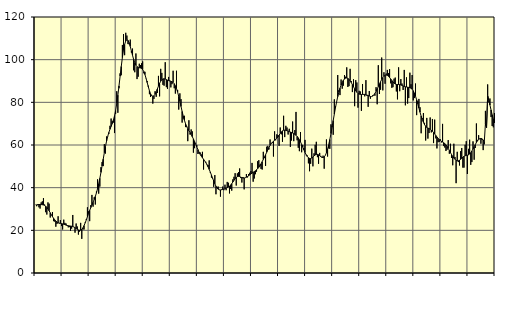
| Category | Piggar | Series 1 |
|---|---|---|
| nan | 32 | 31.98 |
| 87.0 | 31.3 | 31.92 |
| 87.0 | 32.3 | 32.09 |
| 87.0 | 30.8 | 32.1 |
| 87.0 | 30.2 | 32.1 |
| 87.0 | 33.1 | 32.07 |
| 87.0 | 33.6 | 32 |
| 87.0 | 35.1 | 31.88 |
| 87.0 | 32.1 | 31.68 |
| 87.0 | 28.5 | 31.33 |
| 87.0 | 27.4 | 30.77 |
| 87.0 | 33.1 | 30.03 |
| nan | 32.5 | 29.16 |
| 88.0 | 26 | 28.23 |
| 88.0 | 27.1 | 27.31 |
| 88.0 | 28.6 | 26.43 |
| 88.0 | 24.3 | 25.63 |
| 88.0 | 24.1 | 24.93 |
| 88.0 | 21.7 | 24.35 |
| 88.0 | 23 | 23.9 |
| 88.0 | 26.6 | 23.58 |
| 88.0 | 23.2 | 23.4 |
| 88.0 | 24.8 | 23.29 |
| 88.0 | 22 | 23.17 |
| nan | 20.4 | 23.03 |
| 89.0 | 25 | 22.85 |
| 89.0 | 23.5 | 22.66 |
| 89.0 | 23.2 | 22.47 |
| 89.0 | 22.1 | 22.31 |
| 89.0 | 21.4 | 22.17 |
| 89.0 | 21.5 | 22.08 |
| 89.0 | 19.8 | 22.02 |
| 89.0 | 20.8 | 21.93 |
| 89.0 | 27.2 | 21.78 |
| 89.0 | 21.6 | 21.56 |
| 89.0 | 18.9 | 21.23 |
| nan | 23.2 | 20.85 |
| 90.0 | 21.8 | 20.48 |
| 90.0 | 18 | 20.18 |
| 90.0 | 19.4 | 20.02 |
| 90.0 | 23.5 | 20.1 |
| 90.0 | 16 | 20.46 |
| 90.0 | 20.4 | 21.18 |
| 90.0 | 20.4 | 22.21 |
| 90.0 | 23.7 | 23.47 |
| 90.0 | 25.3 | 24.88 |
| 90.0 | 30.8 | 26.38 |
| 90.0 | 28.9 | 27.88 |
| nan | 24.3 | 29.32 |
| 91.0 | 31.8 | 30.66 |
| 91.0 | 36.6 | 31.91 |
| 91.0 | 31.1 | 33.15 |
| 91.0 | 35.5 | 34.44 |
| 91.0 | 32.1 | 35.88 |
| 91.0 | 38.2 | 37.56 |
| 91.0 | 43.9 | 39.54 |
| 91.0 | 37.2 | 41.82 |
| 91.0 | 40.5 | 44.37 |
| 91.0 | 49.6 | 47.17 |
| 91.0 | 52 | 50.19 |
| nan | 50.1 | 53.33 |
| 92.0 | 60.4 | 56.41 |
| 92.0 | 56 | 59.28 |
| 92.0 | 64 | 61.85 |
| 92.0 | 63.9 | 64.04 |
| 92.0 | 65.2 | 65.88 |
| 92.0 | 69 | 67.4 |
| 92.0 | 72.4 | 68.69 |
| 92.0 | 71.1 | 70 |
| 92.0 | 70.5 | 71.57 |
| 92.0 | 65.6 | 73.58 |
| 92.0 | 74.6 | 76.18 |
| nan | 85.2 | 79.45 |
| 93.0 | 75.1 | 83.34 |
| 93.0 | 86.6 | 87.7 |
| 93.0 | 93.6 | 92.28 |
| 93.0 | 92.7 | 96.81 |
| 93.0 | 106.9 | 100.99 |
| 93.0 | 112 | 104.5 |
| 93.0 | 102.1 | 107.13 |
| 93.0 | 112.6 | 108.76 |
| 93.0 | 111.3 | 109.38 |
| 93.0 | 107.3 | 109.06 |
| 93.0 | 107.2 | 107.94 |
| nan | 109.4 | 106.19 |
| 94.0 | 103.3 | 104.11 |
| 94.0 | 105.2 | 102.02 |
| 94.0 | 95 | 100.12 |
| 94.0 | 94.1 | 98.57 |
| 94.0 | 102.9 | 97.44 |
| 94.0 | 90.9 | 96.71 |
| 94.0 | 92 | 96.33 |
| 94.0 | 98.1 | 96.2 |
| 94.0 | 97.5 | 96.1 |
| 94.0 | 98.3 | 95.87 |
| 94.0 | 99.2 | 95.35 |
| nan | 93.6 | 94.42 |
| 95.0 | 94.3 | 93.04 |
| 95.0 | 91.4 | 91.27 |
| 95.0 | 90 | 89.29 |
| 95.0 | 87.8 | 87.3 |
| 95.0 | 83.8 | 85.46 |
| 95.0 | 82.5 | 84 |
| 95.0 | 83.4 | 83.11 |
| 95.0 | 79.4 | 82.79 |
| 95.0 | 81.6 | 83.03 |
| 95.0 | 85.2 | 83.79 |
| 95.0 | 82.6 | 84.91 |
| nan | 84.4 | 86.24 |
| 96.0 | 92.4 | 87.62 |
| 96.0 | 82.8 | 88.89 |
| 96.0 | 95.7 | 89.9 |
| 96.0 | 93.8 | 90.58 |
| 96.0 | 88.2 | 90.96 |
| 96.0 | 87.8 | 91.04 |
| 96.0 | 98.8 | 90.89 |
| 96.0 | 87.1 | 90.66 |
| 96.0 | 86.3 | 90.41 |
| 96.0 | 91.9 | 90.18 |
| 96.0 | 90.2 | 90 |
| nan | 87 | 89.86 |
| 97.0 | 88.5 | 89.65 |
| 97.0 | 94.8 | 89.3 |
| 97.0 | 86.6 | 88.71 |
| 97.0 | 84.1 | 87.78 |
| 97.0 | 94.8 | 86.49 |
| 97.0 | 85.8 | 84.81 |
| 97.0 | 76.6 | 82.78 |
| 97.0 | 84.2 | 80.48 |
| 97.0 | 81.5 | 78.07 |
| 97.0 | 70.5 | 75.72 |
| 97.0 | 72.4 | 73.55 |
| nan | 73.7 | 71.64 |
| 98.0 | 68.4 | 70.05 |
| 98.0 | 68.4 | 68.75 |
| 98.0 | 61.8 | 67.67 |
| 98.0 | 71.6 | 66.74 |
| 98.0 | 64.9 | 65.84 |
| 98.0 | 67.3 | 64.9 |
| 98.0 | 66.4 | 63.91 |
| 98.0 | 56.4 | 62.84 |
| 98.0 | 58.5 | 61.65 |
| 98.0 | 60.6 | 60.39 |
| 98.0 | 60 | 59.11 |
| nan | 55.8 | 57.85 |
| 99.0 | 56 | 56.67 |
| 99.0 | 56.5 | 55.64 |
| 99.0 | 55.6 | 54.78 |
| 99.0 | 56.8 | 54.02 |
| 99.0 | 48.5 | 53.3 |
| 99.0 | 52.6 | 52.57 |
| 99.0 | 52.1 | 51.75 |
| 99.0 | 50.6 | 50.81 |
| 99.0 | 50.6 | 49.75 |
| 99.0 | 52.8 | 48.58 |
| 99.0 | 46.9 | 47.29 |
| nan | 44.7 | 45.91 |
| 0.0 | 44.3 | 44.5 |
| 0.0 | 40.4 | 43.12 |
| 0.0 | 45.9 | 41.83 |
| 0.0 | 36.9 | 40.7 |
| 0.0 | 40.4 | 39.82 |
| 0.0 | 40.5 | 39.26 |
| 0.0 | 38.9 | 38.99 |
| 0.0 | 35.8 | 38.94 |
| 0.0 | 39.2 | 39.03 |
| 0.0 | 40.5 | 39.17 |
| 0.0 | 38.8 | 39.35 |
| nan | 41.4 | 39.55 |
| 1.0 | 38.8 | 39.77 |
| 1.0 | 42.7 | 40.01 |
| 1.0 | 42.3 | 40.3 |
| 1.0 | 37.3 | 40.68 |
| 1.0 | 39.4 | 41.2 |
| 1.0 | 38.6 | 41.87 |
| 1.0 | 43.9 | 42.64 |
| 1.0 | 45.1 | 43.45 |
| 1.0 | 46.8 | 44.2 |
| 1.0 | 41 | 44.8 |
| 1.0 | 46.7 | 45.17 |
| nan | 47.3 | 45.31 |
| 2.0 | 49 | 45.21 |
| 2.0 | 44.5 | 44.97 |
| 2.0 | 42.4 | 44.71 |
| 2.0 | 45 | 44.54 |
| 2.0 | 39.2 | 44.53 |
| 2.0 | 44.7 | 44.67 |
| 2.0 | 46.4 | 44.91 |
| 2.0 | 44.8 | 45.21 |
| 2.0 | 46.4 | 45.57 |
| 2.0 | 47 | 45.99 |
| 2.0 | 47.8 | 46.42 |
| nan | 51.6 | 46.81 |
| 3.0 | 42.8 | 47.18 |
| 3.0 | 44.3 | 47.53 |
| 3.0 | 46.3 | 47.92 |
| 3.0 | 47.5 | 48.38 |
| 3.0 | 52.4 | 48.91 |
| 3.0 | 52.9 | 49.56 |
| 3.0 | 50.8 | 50.29 |
| 3.0 | 48.8 | 51.18 |
| 3.0 | 48.5 | 52.17 |
| 3.0 | 56.8 | 53.24 |
| 3.0 | 53.9 | 54.34 |
| nan | 50.2 | 55.45 |
| 4.0 | 59.2 | 56.58 |
| 4.0 | 59.6 | 57.72 |
| 4.0 | 57.9 | 58.81 |
| 4.0 | 62.6 | 59.81 |
| 4.0 | 60.8 | 60.63 |
| 4.0 | 60.9 | 61.27 |
| 4.0 | 54.6 | 61.77 |
| 4.0 | 66.4 | 62.22 |
| 4.0 | 62.2 | 62.69 |
| 4.0 | 65 | 63.23 |
| 4.0 | 64.5 | 63.86 |
| nan | 59.6 | 64.63 |
| 5.0 | 68.2 | 65.41 |
| 5.0 | 65 | 66.11 |
| 5.0 | 61.5 | 66.65 |
| 5.0 | 73.7 | 66.93 |
| 5.0 | 63.7 | 66.97 |
| 5.0 | 69 | 66.85 |
| 5.0 | 68.2 | 66.69 |
| 5.0 | 64.9 | 66.5 |
| 5.0 | 67.6 | 66.29 |
| 5.0 | 59.1 | 66.08 |
| 5.0 | 62.1 | 65.87 |
| nan | 71 | 65.63 |
| 6.0 | 61.8 | 65.35 |
| 6.0 | 67 | 65 |
| 6.0 | 75.5 | 64.56 |
| 6.0 | 62.2 | 64.03 |
| 6.0 | 58.7 | 63.35 |
| 6.0 | 57.1 | 62.48 |
| 6.0 | 66.1 | 61.44 |
| 6.0 | 56.6 | 60.27 |
| 6.0 | 60 | 59.01 |
| 6.0 | 58.6 | 57.72 |
| 6.0 | 62.4 | 56.51 |
| nan | 55.2 | 55.46 |
| 7.0 | 55.1 | 54.61 |
| 7.0 | 51.4 | 54.03 |
| 7.0 | 47.7 | 53.71 |
| 7.0 | 51.2 | 53.65 |
| 7.0 | 58.3 | 53.91 |
| 7.0 | 50 | 54.39 |
| 7.0 | 56.1 | 54.9 |
| 7.0 | 60.1 | 55.33 |
| 7.0 | 61.5 | 55.59 |
| 7.0 | 54.3 | 55.63 |
| 7.0 | 51.2 | 55.41 |
| nan | 56.3 | 55 |
| 8.0 | 54.9 | 54.56 |
| 8.0 | 54 | 54.22 |
| 8.0 | 55 | 54.13 |
| 8.0 | 48.9 | 54.41 |
| 8.0 | 55.2 | 55.14 |
| 8.0 | 62.6 | 56.35 |
| 8.0 | 54.6 | 58.05 |
| 8.0 | 58.4 | 60.14 |
| 8.0 | 58.2 | 62.59 |
| 8.0 | 69.7 | 65.36 |
| 8.0 | 69 | 68.36 |
| nan | 64.8 | 71.46 |
| 9.0 | 81.4 | 74.51 |
| 9.0 | 78.1 | 77.42 |
| 9.0 | 79.8 | 80.16 |
| 9.0 | 92.8 | 82.64 |
| 9.0 | 85.7 | 84.8 |
| 9.0 | 83.4 | 86.62 |
| 9.0 | 90.7 | 88.11 |
| 9.0 | 86.4 | 89.36 |
| 9.0 | 87.8 | 90.33 |
| 9.0 | 92.8 | 90.98 |
| 9.0 | 92 | 91.33 |
| nan | 96.4 | 91.41 |
| 10.0 | 87.2 | 91.22 |
| 10.0 | 87.6 | 90.77 |
| 10.0 | 95.7 | 90.12 |
| 10.0 | 90 | 89.28 |
| 10.0 | 84.8 | 88.33 |
| 10.0 | 90.8 | 87.3 |
| 10.0 | 78.2 | 86.26 |
| 10.0 | 90.4 | 85.36 |
| 10.0 | 89.3 | 84.66 |
| 10.0 | 77.5 | 84.17 |
| 10.0 | 85.4 | 83.86 |
| nan | 85.1 | 83.71 |
| 11.0 | 76 | 83.67 |
| 11.0 | 88.6 | 83.71 |
| 11.0 | 83.9 | 83.73 |
| 11.0 | 82.8 | 83.71 |
| 11.0 | 90.4 | 83.59 |
| 11.0 | 83 | 83.4 |
| 11.0 | 77.9 | 83.18 |
| 11.0 | 85.3 | 82.95 |
| 11.0 | 81.7 | 82.75 |
| 11.0 | 82.7 | 82.71 |
| 11.0 | 83.3 | 82.93 |
| nan | 83.3 | 83.43 |
| 12.0 | 83.1 | 84.19 |
| 12.0 | 87.1 | 85.17 |
| 12.0 | 79.1 | 86.24 |
| 12.0 | 97.4 | 87.39 |
| 12.0 | 83.9 | 88.55 |
| 12.0 | 85.9 | 89.68 |
| 12.0 | 101 | 90.73 |
| 12.0 | 85.6 | 91.61 |
| 12.0 | 94.1 | 92.24 |
| 12.0 | 88.7 | 92.65 |
| 12.0 | 93.5 | 92.77 |
| nan | 95.2 | 92.62 |
| 13.0 | 93.7 | 92.22 |
| 13.0 | 95.6 | 91.64 |
| 13.0 | 88.9 | 90.95 |
| 13.0 | 86.8 | 90.22 |
| 13.0 | 87.1 | 89.52 |
| 13.0 | 91.1 | 88.97 |
| 13.0 | 91.6 | 88.59 |
| 13.0 | 85.1 | 88.4 |
| 13.0 | 81.4 | 88.36 |
| 13.0 | 96.4 | 88.35 |
| 13.0 | 85.2 | 88.29 |
| nan | 90.9 | 88.15 |
| 14.0 | 88.8 | 87.94 |
| 14.0 | 85.8 | 87.68 |
| 14.0 | 95.2 | 87.45 |
| 14.0 | 78.6 | 87.29 |
| 14.0 | 91.7 | 87.19 |
| 14.0 | 79.4 | 87.09 |
| 14.0 | 82 | 86.99 |
| 14.0 | 93.9 | 86.87 |
| 14.0 | 88.5 | 86.63 |
| 14.0 | 92.8 | 86.16 |
| 14.0 | 80.9 | 85.39 |
| nan | 82 | 84.29 |
| 15.0 | 88.8 | 82.88 |
| 15.0 | 74 | 81.2 |
| 15.0 | 80.5 | 79.32 |
| 15.0 | 81.6 | 77.32 |
| 15.0 | 77.7 | 75.37 |
| 15.0 | 65.5 | 73.56 |
| 15.0 | 72.6 | 71.98 |
| 15.0 | 75 | 70.64 |
| 15.0 | 70.4 | 69.56 |
| 15.0 | 62.1 | 68.78 |
| 15.0 | 72.7 | 68.26 |
| nan | 63 | 67.95 |
| 16.0 | 65.6 | 67.71 |
| 16.0 | 72.9 | 67.41 |
| 16.0 | 65.9 | 67.01 |
| 16.0 | 72.2 | 66.47 |
| 16.0 | 60.9 | 65.83 |
| 16.0 | 71.9 | 65.16 |
| 16.0 | 63.1 | 64.47 |
| 16.0 | 58.4 | 63.78 |
| 16.0 | 61.3 | 63.11 |
| 16.0 | 61.4 | 62.54 |
| 16.0 | 62.7 | 62.11 |
| nan | 61.2 | 61.74 |
| 17.0 | 69.9 | 61.4 |
| 17.0 | 59.5 | 61.06 |
| 17.0 | 58.8 | 60.63 |
| 17.0 | 57.2 | 60.06 |
| 17.0 | 57.8 | 59.34 |
| 17.0 | 62.3 | 58.47 |
| 17.0 | 55.9 | 57.45 |
| 17.0 | 60.6 | 56.42 |
| 17.0 | 53.9 | 55.48 |
| 17.0 | 50.5 | 54.63 |
| 17.0 | 60.6 | 53.87 |
| nan | 54.4 | 53.27 |
| 18.0 | 42.1 | 52.85 |
| 18.0 | 56.8 | 52.6 |
| 18.0 | 52 | 52.6 |
| 18.0 | 50.4 | 52.85 |
| 18.0 | 57.1 | 53.27 |
| 18.0 | 58.6 | 53.78 |
| 18.0 | 49.4 | 54.28 |
| 18.0 | 49.4 | 54.69 |
| 18.0 | 60.1 | 54.94 |
| 18.0 | 61.8 | 55.1 |
| 18.0 | 46.4 | 55.22 |
| nan | 58.2 | 55.39 |
| 19.0 | 62.5 | 55.75 |
| 19.0 | 50.7 | 56.37 |
| 19.0 | 52 | 57.2 |
| 19.0 | 61.7 | 58.17 |
| 19.0 | 53.1 | 59.21 |
| 19.0 | 58.6 | 60.21 |
| 19.0 | 70.1 | 61.14 |
| 19.0 | 62.4 | 61.95 |
| 19.0 | 64.6 | 62.57 |
| 19.0 | 62.8 | 62.95 |
| 19.0 | 60.6 | 63.09 |
| nan | 62.4 | 62.92 |
| 20.0 | 57.6 | 62.37 |
| 20.0 | 60.3 | 61.44 |
| 20.0 | 76 | 69.91 |
| 20.0 | 68 | 68.33 |
| 20.0 | 88.4 | 83.09 |
| 20.0 | 80 | 81 |
| 20.0 | 81.8 | 78.74 |
| 20.0 | 73.1 | 76.41 |
| 20.0 | 68.9 | 74.16 |
| 20.0 | 68.3 | 72.09 |
| 20.0 | 75 | 70.32 |